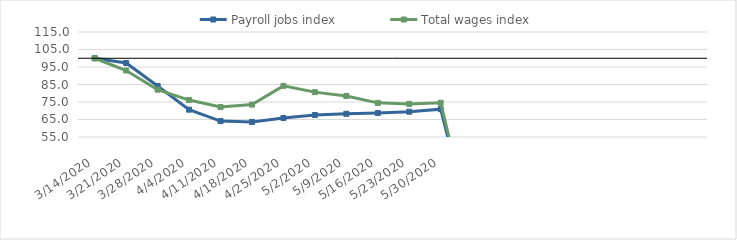
| Category | Payroll jobs index | Total wages index |
|---|---|---|
| 14/03/2020 | 100 | 100 |
| 21/03/2020 | 97.296 | 92.989 |
| 28/03/2020 | 84.155 | 82.044 |
| 04/04/2020 | 70.631 | 76.105 |
| 11/04/2020 | 64.103 | 72.102 |
| 18/04/2020 | 63.599 | 73.503 |
| 25/04/2020 | 65.865 | 84.226 |
| 02/05/2020 | 67.539 | 80.635 |
| 09/05/2020 | 68.276 | 78.467 |
| 16/05/2020 | 68.721 | 74.507 |
| 23/05/2020 | 69.458 | 73.902 |
| 30/05/2020 | 70.902 | 74.558 |